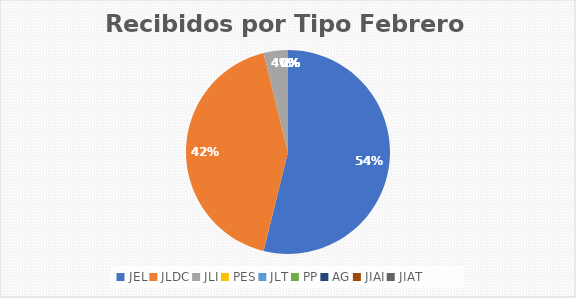
| Category | Series 0 |
|---|---|
| JEL | 14 |
| JLDC | 11 |
| JLI | 1 |
| PES | 0 |
| JLT | 0 |
| PP | 0 |
| AG | 0 |
| JIAI | 0 |
| JIAT | 0 |